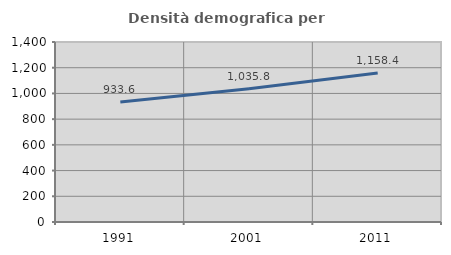
| Category | Densità demografica |
|---|---|
| 1991.0 | 933.572 |
| 2001.0 | 1035.812 |
| 2011.0 | 1158.351 |